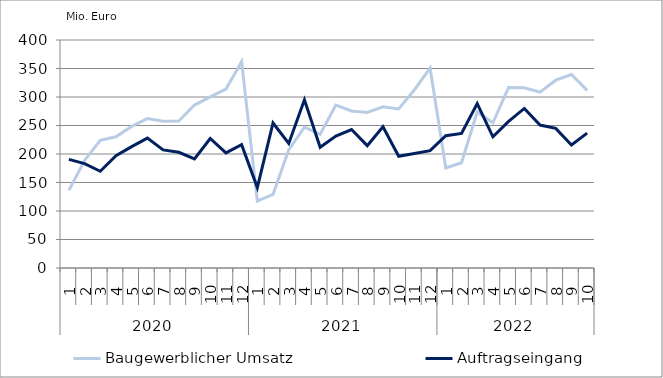
| Category | Baugewerblicher Umsatz | Auftragseingang |
|---|---|---|
| 0 | 136135.432 | 190647.086 |
| 1 | 188682.361 | 183141.14 |
| 2 | 224009.315 | 169770.009 |
| 3 | 230172.252 | 196979.845 |
| 4 | 248410.714 | 212955.83 |
| 5 | 262078.128 | 227853.487 |
| 6 | 257360.37 | 207209.188 |
| 7 | 257932.168 | 202976.091 |
| 8 | 285866.269 | 191463.844 |
| 9 | 300164.57 | 227245.467 |
| 10 | 313922.518 | 202060.636 |
| 11 | 362040.738 | 216296.504 |
| 12 | 117421.805 | 141020.655 |
| 13 | 129162.55 | 254416.876 |
| 14 | 207280.837 | 218451.405 |
| 15 | 247094.279 | 295077.868 |
| 16 | 234515.312 | 211696.129 |
| 17 | 285732.845 | 231455.155 |
| 18 | 275480.885 | 242932.505 |
| 19 | 272787.524 | 214636.944 |
| 20 | 282850.254 | 247827.991 |
| 21 | 279173.21 | 196069.238 |
| 22 | 312511.437 | 201015.897 |
| 23 | 350582.01 | 205949.991 |
| 24 | 175456.852 | 232178.255 |
| 25 | 184578.32 | 236006.862 |
| 26 | 273732.567 | 288451.109 |
| 27 | 254683.671 | 230228.968 |
| 28 | 316794.568 | 257235.39 |
| 29 | 316277.567 | 279900.179 |
| 30 | 308621.034 | 250827.343 |
| 31 | 329490.411 | 244949.341 |
| 32 | 339435.208 | 215809.075 |
| 33 | 311599.811 | 236674.056 |